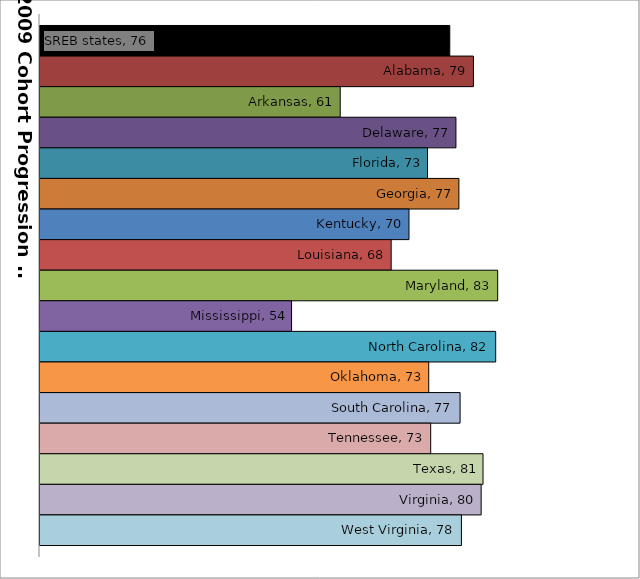
| Category | SREB states | Alabama | Arkansas | Delaware | Florida | Georgia | Kentucky | Louisiana | Maryland | Mississippi | North Carolina | Oklahoma | South Carolina | Tennessee | Texas | Virginia | West Virginia |
|---|---|---|---|---|---|---|---|---|---|---|---|---|---|---|---|---|---|
| 0 | 76.038 | 79.274 | 61.055 | 76.881 | 72.996 | 77.284 | 70.459 | 68.023 | 82.588 | 54.401 | 82.318 | 73.159 | 77.447 | 73.428 | 80.584 | 80.328 | 77.632 |